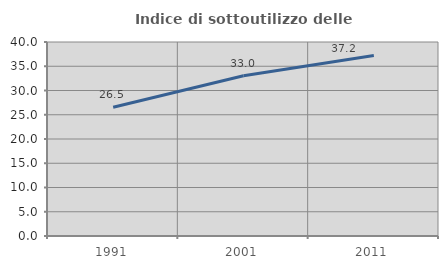
| Category | Indice di sottoutilizzo delle abitazioni  |
|---|---|
| 1991.0 | 26.536 |
| 2001.0 | 33.038 |
| 2011.0 | 37.222 |